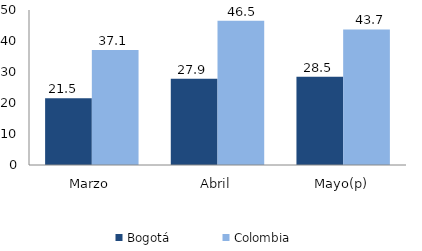
| Category | Bogotá | Colombia |
|---|---|---|
| Marzo | 21.495 | 37.133 |
| Abril | 27.862 | 46.493 |
| Mayo(p) | 28.492 | 43.73 |